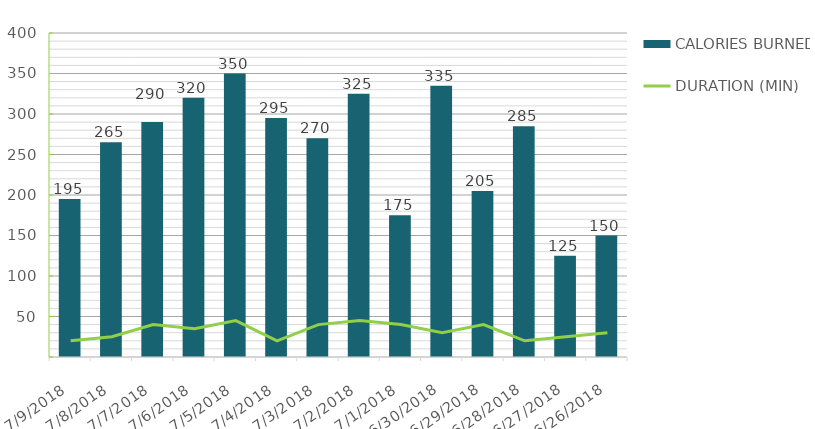
| Category | CALORIES BURNED |
|---|---|
| 7/9/18 | 195 |
| 7/8/18 | 265 |
| 7/7/18 | 290 |
| 7/6/18 | 320 |
| 7/5/18 | 350 |
| 7/4/18 | 295 |
| 7/3/18 | 270 |
| 7/2/18 | 325 |
| 7/1/18 | 175 |
| 6/30/18 | 335 |
| 6/29/18 | 205 |
| 6/28/18 | 285 |
| 6/27/18 | 125 |
| 6/26/18 | 150 |